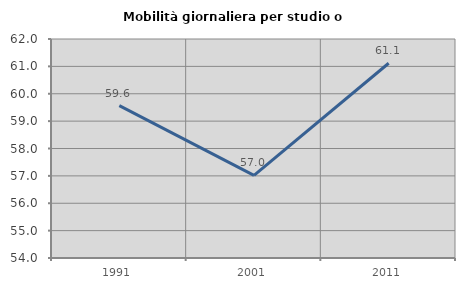
| Category | Mobilità giornaliera per studio o lavoro |
|---|---|
| 1991.0 | 59.567 |
| 2001.0 | 57.02 |
| 2011.0 | 61.115 |